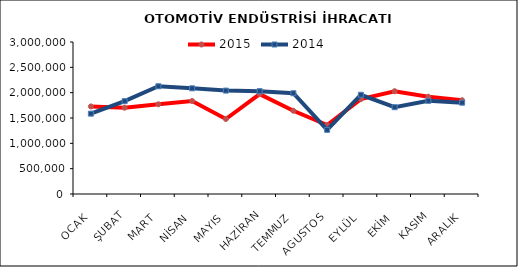
| Category | 2015 | 2014 |
|---|---|---|
| OCAK | 1728185.638 | 1585958.43 |
| ŞUBAT | 1703300.464 | 1832628.801 |
| MART | 1770557.591 | 2126491.387 |
| NİSAN | 1835810.588 | 2085923.821 |
| MAYIS | 1480147.354 | 2040798.158 |
| HAZİRAN | 1970824.772 | 2029745.344 |
| TEMMUZ | 1643158.967 | 1988596.284 |
| AGUSTOS | 1361782.786 | 1266764.673 |
| EYLÜL | 1874021.703 | 1958550.819 |
| EKİM | 2028533.43 | 1712962.049 |
| KASIM | 1920562.846 | 1839051.327 |
| ARALIK | 1849791.561 | 1802455.05 |